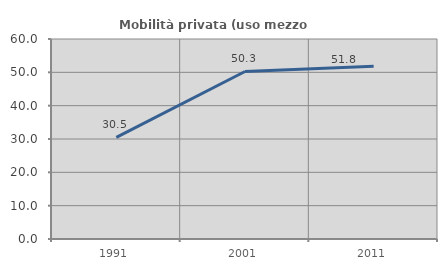
| Category | Mobilità privata (uso mezzo privato) |
|---|---|
| 1991.0 | 30.478 |
| 2001.0 | 50.252 |
| 2011.0 | 51.825 |